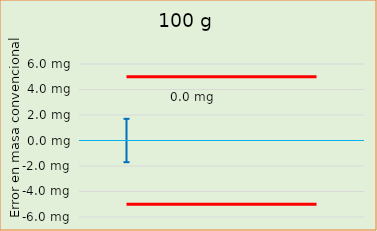
| Category | Error en masa convencional  |  ± EMP |
|---|---|---|
| 0 |  | -5 |
| 1 |  | -5 |
| 2 |  | -5 |